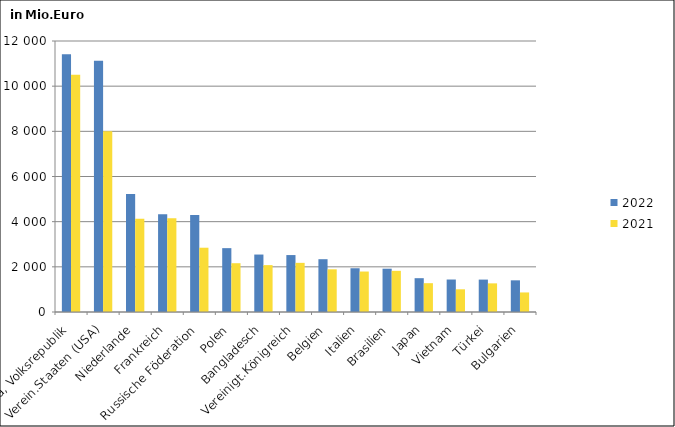
| Category | 2022 | 2021 |
|---|---|---|
| China, Volksrepublik | 11410.217 | 10502.135 |
| Verein.Staaten (USA) | 11126.493 | 7998.626 |
| Niederlande | 5225.056 | 4129.856 |
| Frankreich | 4326.224 | 4148.28 |
| Russische Föderation | 4296.278 | 2846.415 |
| Polen | 2827.469 | 2160.262 |
| Bangladesch | 2544.121 | 2076.076 |
| Vereinigt.Königreich | 2521.13 | 2176.438 |
| Belgien | 2337.857 | 1890.009 |
| Italien | 1937.438 | 1791.759 |
| Brasilien | 1917.28 | 1822.961 |
| Japan | 1497.411 | 1275.844 |
| Vietnam | 1438.085 | 1004.83 |
| Türkei | 1434.8 | 1268.128 |
| Bulgarien | 1402.479 | 865.932 |